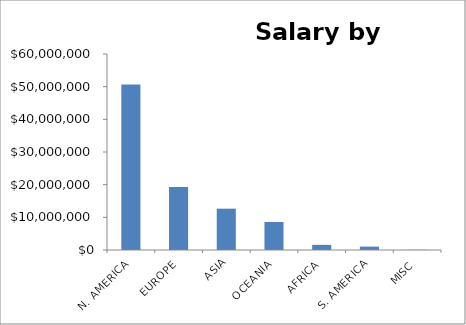
| Category | Total |
|---|---|
| N. AMERICA | 50648846.503 |
| EUROPE | 19258005.715 |
| ASIA | 12650854.418 |
| OCEANIA | 8575781.343 |
| AFRICA | 1575309.804 |
| S. AMERICA | 1030090.731 |
| MISC | 62000 |